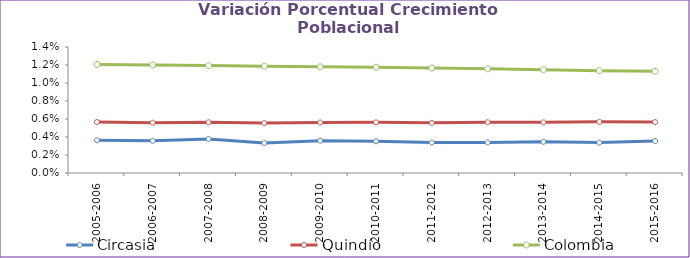
| Category | Circasia | Quindío | Colombia |
|---|---|---|---|
| 2005-2006 | 0.004 | 0.006 | 0.012 |
| 2006-2007 | 0.004 | 0.006 | 0.012 |
| 2007-2008 | 0.004 | 0.006 | 0.012 |
| 2008-2009 | 0.003 | 0.006 | 0.012 |
| 2009-2010 | 0.004 | 0.006 | 0.012 |
| 2010-2011 | 0.004 | 0.006 | 0.012 |
| 2011-2012 | 0.003 | 0.006 | 0.012 |
| 2012-2013 | 0.003 | 0.006 | 0.012 |
| 2013-2014 | 0.003 | 0.006 | 0.011 |
| 2014-2015 | 0.003 | 0.006 | 0.011 |
| 2015-2016 | 0.004 | 0.006 | 0.011 |